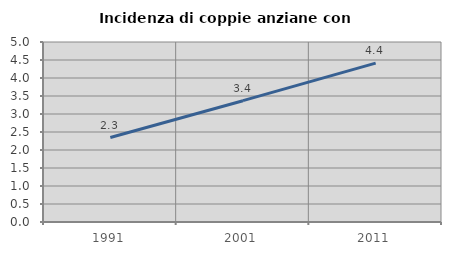
| Category | Incidenza di coppie anziane con figli |
|---|---|
| 1991.0 | 2.346 |
| 2001.0 | 3.37 |
| 2011.0 | 4.414 |